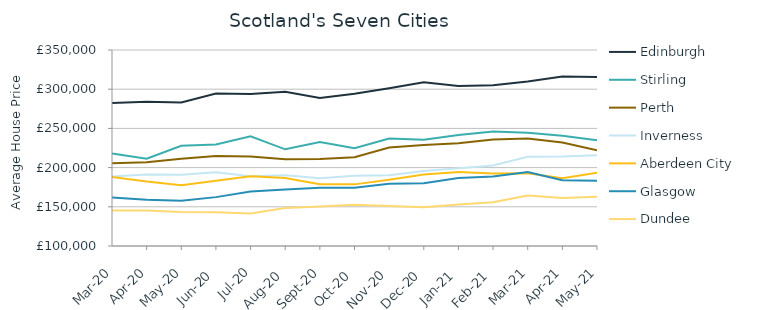
| Category | Edinburgh | Stirling | Perth | Inverness | Aberdeen City | Glasgow | Dundee |
|---|---|---|---|---|---|---|---|
| 2020-03-01 | 282302.486 | 218024.696 | 205391.201 | 188509.912 | 188082.306 | 161734.229 | 145397.112 |
| 2020-04-01 | 283948.508 | 211425.89 | 206700.265 | 191062.57 | 182263.548 | 158906.437 | 145288.837 |
| 2020-05-01 | 282997.164 | 227765.44 | 211312.944 | 190830.992 | 177539.278 | 157707.026 | 143241.986 |
| 2020-06-01 | 294405.336 | 229502.932 | 214758.379 | 194065.76 | 183263.838 | 162347.046 | 142968.562 |
| 2020-07-01 | 293981.636 | 239998.067 | 214071.997 | 189039.702 | 189064.298 | 169615.934 | 141564.902 |
| 2020-08-01 | 296782.986 | 223302.21 | 210760.339 | 190218.25 | 186815.882 | 172001.695 | 148449.903 |
| 2020-09-01 | 288903.986 | 232742.116 | 211024.374 | 186405.805 | 178886.938 | 174193.263 | 150309.739 |
| 2020-10-01 | 294200.158 | 224725.277 | 213351.022 | 189737.119 | 178613.316 | 174329.748 | 152604.417 |
| 2020-11-01 | 301104.512 | 237199.397 | 225593.27 | 190336.957 | 184546.232 | 179541.232 | 150869.686 |
| 2020-12-01 | 308997.125 | 235633.298 | 228800.822 | 195573.653 | 191067.843 | 180034.332 | 149337.586 |
| 2021-01-01 | 304010.588 | 241577.942 | 231052.8 | 199150.158 | 194448.579 | 186669.057 | 152922.028 |
| 2021-02-01 | 305052.263 | 246171.252 | 235989.973 | 202740.447 | 192380.996 | 188525.342 | 155762.01 |
| 2021-03-01 | 309744.89 | 244532.103 | 237046.137 | 213895.213 | 192907.644 | 194245.478 | 164539.672 |
| 2021-04-01 | 316231.397 | 240719.589 | 231985.535 | 214067.729 | 186450.405 | 183884.768 | 161110.058 |
| 2021-05-01 | 315516.724 | 234891.429 | 222125.171 | 215678.303 | 193355.284 | 183282.27 | 162685.428 |